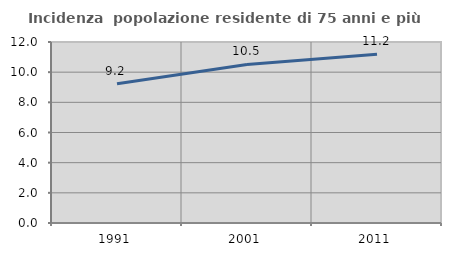
| Category | Incidenza  popolazione residente di 75 anni e più |
|---|---|
| 1991.0 | 9.226 |
| 2001.0 | 10.513 |
| 2011.0 | 11.184 |